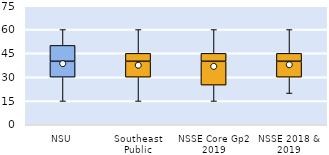
| Category | 25th | 50th | 75th |
|---|---|---|---|
| NSU | 30 | 10 | 10 |
| Southeast Public | 30 | 10 | 5 |
| NSSE Core Gp2 2019 | 25 | 15 | 5 |
| NSSE 2018 & 2019 | 30 | 10 | 5 |